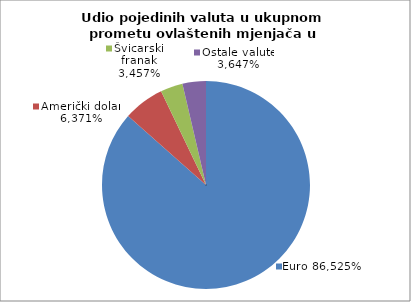
| Category | EUR |
|---|---|
| 0 | 0.865 |
| 1 | 0.064 |
| 2 | 0.035 |
| 3 | 0.036 |